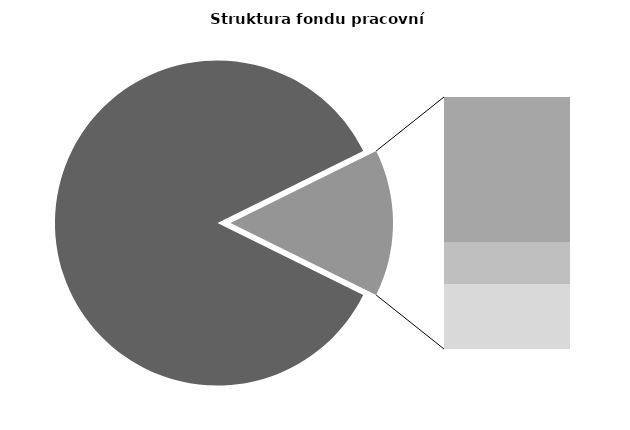
| Category | Series 0 |
|---|---|
| Průměrná měsíční odpracovaná doba bez přesčasu | 146.602 |
| Dovolená | 14.511 |
| Nemoc | 4.11 |
| Jiné | 6.468 |